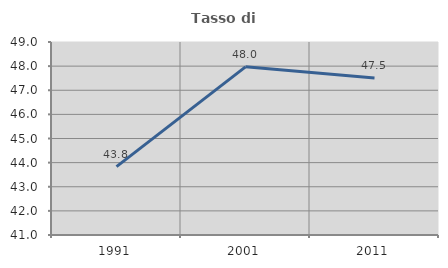
| Category | Tasso di occupazione   |
|---|---|
| 1991.0 | 43.836 |
| 2001.0 | 47.971 |
| 2011.0 | 47.506 |